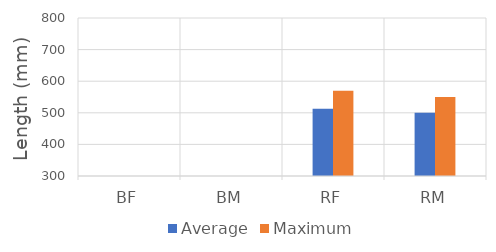
| Category | Average | Maximum |
|---|---|---|
| BF | 0 | 0 |
| BM | 0 | 0 |
| RF | 512.66 | 570 |
| RM | 499.815 | 550 |